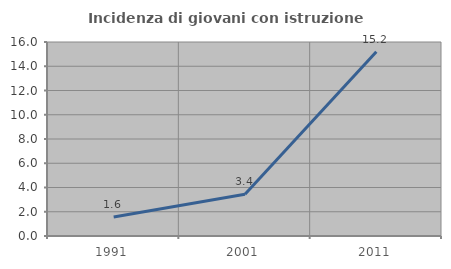
| Category | Incidenza di giovani con istruzione universitaria |
|---|---|
| 1991.0 | 1.562 |
| 2001.0 | 3.448 |
| 2011.0 | 15.19 |